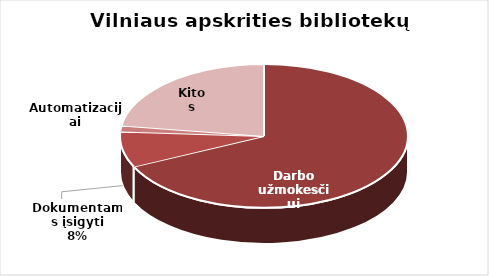
| Category | Series 0 |
|---|---|
| Darbo užmokesčiui | 4282824 |
| Dokumentams įsigyti | 505657 |
| Automatizacijai | 83275 |
| Kitos | 1428905.4 |